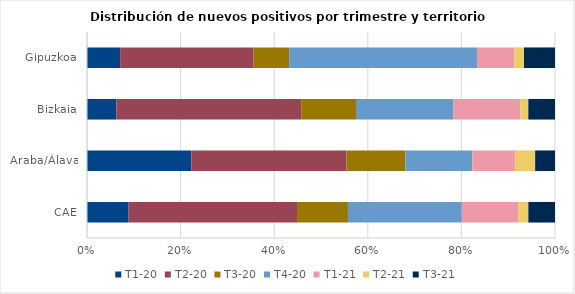
| Category | T1-20 | T2-20 | T3-20 | T4-20 | T1-21 | T2-21 | T3-21 |
|---|---|---|---|---|---|---|---|
| CAE | 8.893 | 35.979 | 10.887 | 24.329 | 12.045 | 2.173 | 5.694 |
| Araba/Álava | 22.31 | 33.15 | 12.569 | 14.297 | 9.112 | 4.321 | 4.242 |
| Bizkaia | 6.266 | 39.496 | 11.717 | 20.834 | 14.297 | 1.688 | 5.703 |
| Gipuzkoa | 7.081 | 28.527 | 7.594 | 40.123 | 8.004 | 2.052 | 6.619 |